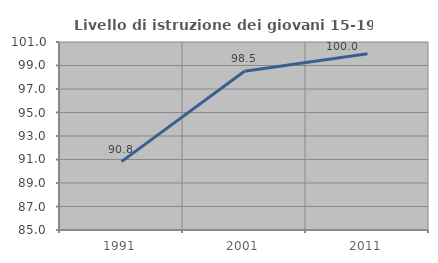
| Category | Livello di istruzione dei giovani 15-19 anni |
|---|---|
| 1991.0 | 90.816 |
| 2001.0 | 98.507 |
| 2011.0 | 100 |